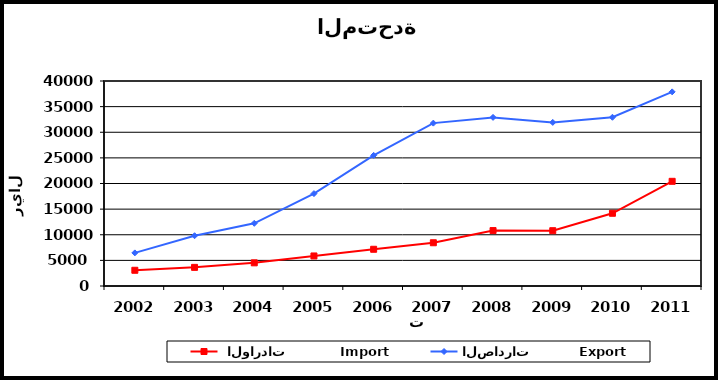
| Category |  الواردات           Import | الصادرات          Export |
|---|---|---|
| 2002.0 | 3068 | 6460 |
| 2003.0 | 3637 | 9812 |
| 2004.0 | 4520 | 12230 |
| 2005.0 | 5862 | 18027 |
| 2006.0 | 7167 | 25488 |
| 2007.0 | 8437 | 31780 |
| 2008.0 | 10814 | 32900 |
| 2009.0 | 10790 | 31921 |
| 2010.0 | 14190 | 32923 |
| 2011.0 | 20426 | 37881 |